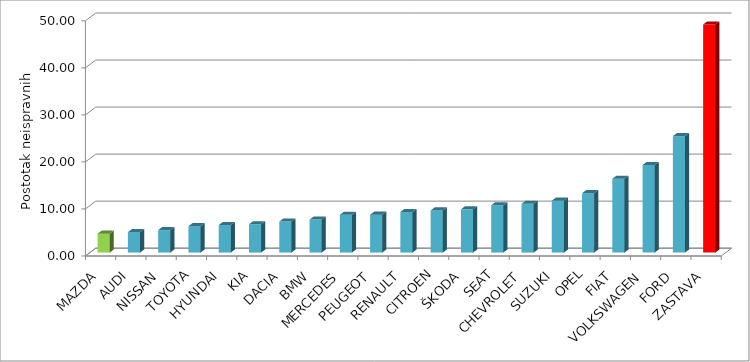
| Category | Series 4 |
|---|---|
| MAZDA | 4.013 |
| AUDI | 4.337 |
| NISSAN | 4.776 |
| TOYOTA | 5.61 |
| HYUNDAI | 5.851 |
| KIA | 6.009 |
| DACIA | 6.584 |
| BMW | 7.009 |
| MERCEDES | 8.022 |
| PEUGEOT | 8.05 |
| RENAULT | 8.622 |
| CITROEN | 8.95 |
| ŠKODA | 9.188 |
| SEAT | 10.054 |
| CHEVROLET | 10.359 |
| SUZUKI | 11.021 |
| OPEL | 12.614 |
| FIAT | 15.691 |
| VOLKSWAGEN | 18.612 |
| FORD | 24.755 |
| ZASTAVA | 48.481 |